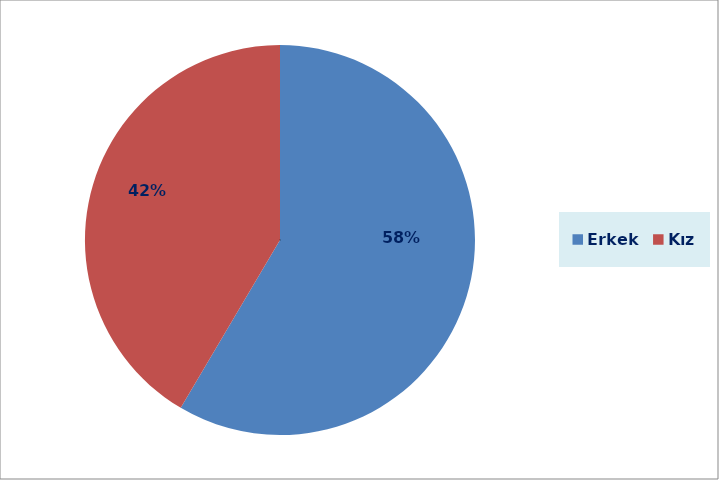
| Category | Sütun1 |
|---|---|
| Erkek | 5014 |
| Kız | 3557 |